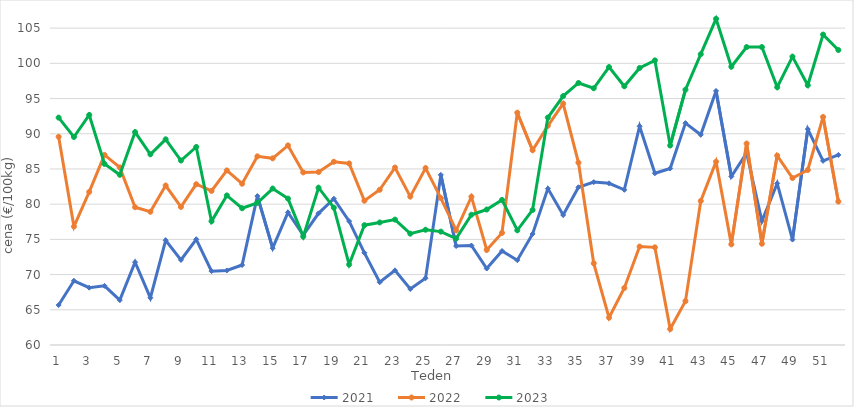
| Category | 2021 | 2022 | 2023 |
|---|---|---|---|
| 1.0 | 65.67 | 89.57 | 92.29 |
| 2.0 | 69.12 | 76.83 | 89.54 |
| 3.0 | 68.14 | 81.74 | 92.67 |
| 4.0 | 68.4 | 87 | 85.72 |
| 5.0 | 66.38 | 85.22 | 84.17 |
| 6.0 | 71.77 | 79.57 | 90.24 |
| 7.0 | 66.7 | 78.92 | 87.08 |
| 8.0 | 74.87 | 82.65 | 89.21 |
| 9.0 | 72.08 | 79.61 | 86.2 |
| 10.0 | 75.01 | 82.83 | 88.12 |
| 11.0 | 70.49 | 81.88 | 77.57 |
| 12.0 | 70.58 | 84.79 | 81.24 |
| 13.0 | 71.36 | 82.9 | 79.42 |
| 14.0 | 81.15 | 86.79 | 80.19 |
| 15.0 | 73.75 | 86.51 | 82.22 |
| 16.0 | 78.84 | 88.34 | 80.79 |
| 17.0 | 75.61 | 84.51 | 75.39 |
| 18.0 | 78.7 | 84.56 | 82.34 |
| 19.0 | 80.77 | 86.02 | 79.5 |
| 20.0 | 77.59 | 85.78 | 71.43 |
| 21.0 | 73.09 | 80.49 | 77.02 |
| 22.0 | 68.91 | 82.04 | 77.4 |
| 23.0 | 70.6 | 85.2 | 77.81 |
| 24.0 | 67.95 | 81.07 | 75.81 |
| 25.0 | 69.49 | 85.12 | 76.37 |
| 26.0 | 84.16 | 80.86 | 76.1 |
| 27.0 | 74.05 | 76.29 | 75.11 |
| 28.0 | 74.13 | 81.06 | 78.5 |
| 29.0 | 70.86 | 73.5 | 79.24 |
| 30.0 | 73.35 | 75.92 | 80.6 |
| 31.0 | 72.04 | 92.99 | 76.29 |
| 32.0 | 75.77 | 87.66 | 79.17 |
| 33.0 | 82.21 | 91.13 | 92.3 |
| 34.0 | 78.46 | 94.28 | 95.35 |
| 35.0 | 82.4 | 85.9 | 97.21 |
| 36.0 | 83.13 | 71.6 | 96.46 |
| 37.0 | 82.96 | 63.88 | 99.47 |
| 38.0 | 82.04 | 68.1 | 96.74 |
| 39.0 | 91.07 | 73.98 | 99.34 |
| 40.0 | 84.39 | 73.87 | 100.42 |
| 41.0 | 85.07 | 62.27 | 88.33 |
| 42.0 | 91.51 | 66.23 | 96.26 |
| 43.0 | 89.85 | 80.45 | 101.3 |
| 44.0 | 96.08 | 86.02 | 106.32 |
| 45.0 | 83.93 | 74.29 | 99.52 |
| 46.0 | 87.26 | 88.61 | 102.31 |
| 47.0 | 77.61 | 74.38 | 102.31 |
| 48.0 | 82.95 | 86.9 | 96.61 |
| 49.0 | 74.97 | 83.71 | 100.95 |
| 50.0 | 90.66 | 84.85 | 96.89 |
| 51.0 | 86.15 | 92.38 | 104.08 |
| 52.0 | 86.99 | 80.37 | 101.89 |